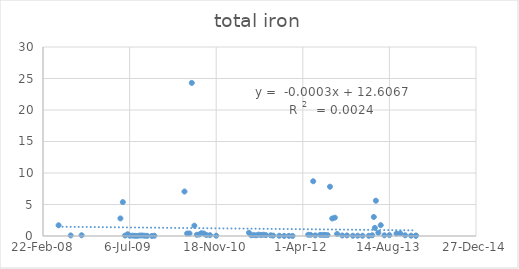
| Category | Series 0 |
|---|---|
| 39590.0 | 1.7 |
| 39660.0 | 0.09 |
| 39723.0 | 0.12 |
| 39947.0 | 2.79 |
| 39961.0 | 5.38 |
| 39974.0 | 0.07 |
| 39989.0 | 0.28 |
| 40002.0 | 0.04 |
| 40017.0 | 0.06 |
| 40031.0 | 0.03 |
| 40045.0 | 0.02 |
| 40059.0 | 0.08 |
| 40073.0 | 0.087 |
| 40087.0 | 0.043 |
| 40101.0 | 0.029 |
| 40129.0 | 0.013 |
| 40143.0 | 0.048 |
| 40317.0 | 7.06 |
| 40332.0 | 0.398 |
| 40346.0 | 0.404 |
| 40359.0 | 24.3 |
| 40374.0 | 1.64 |
| 40388.0 | 0.191 |
| 40402.0 | 0.239 |
| 40415.0 | 0.448 |
| 40429.0 | 0.391 |
| 40443.0 | 0.151 |
| 40464.0 | 0.134 |
| 40500.0 | 0.046 |
| 40689.0 | 0.517 |
| 40702.0 | 0.122 |
| 40717.0 | 0.149 |
| 40731.0 | 0.11 |
| 40745.0 | 0.214 |
| 40759.0 | 0.156 |
| 40773.0 | 0.203 |
| 40787.0 | 0.14 |
| 40815.0 | 0.112 |
| 40829.0 | 0.065 |
| 40864.0 | 0.039 |
| 40892.0 | 0.015 |
| 40920.0 | 0.023 |
| 40941.0 | 0.013 |
| 41031.0 | 0.196 |
| 41045.0 | 0.188 |
| 41060.0 | 8.69 |
| 41072.0 | 0.1 |
| 41100.0 | 0.18 |
| 41114.0 | 0.175 |
| 41128.0 | 0.169 |
| 41143.0 | 0.148 |
| 41157.0 | 7.82 |
| 41170.0 | 2.78 |
| 41185.0 | 2.91 |
| 41198.0 | 0.323 |
| 41228.0 | 0.082 |
| 41255.0 | 0.092 |
| 41289.0 | 0.042 |
| 41317.0 | 0.047 |
| 41345.0 | 0.043 |
| 41381.0 | 0.033 |
| 41401.0 | 0.116 |
| 41410.0 | 3.02 |
| 41416.0 | 1.29 |
| 41422.0 | 5.6 |
| 41436.0 | 0.515 |
| 41450.0 | 1.72 |
| 41471.0 | 0.109 |
| 41500.0 | 0.132 |
| 41541.0 | 0.389 |
| 41563.0 | 0.423 |
| 41591.0 | 0.114 |
| 41625.0 | 0.053 |
| 41653.0 | 0.047 |
| 41653.0 | 0.048 |